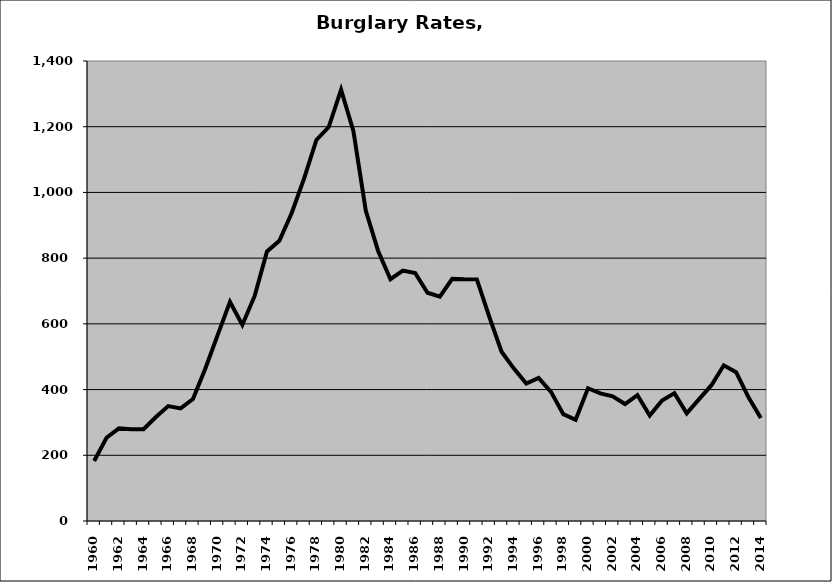
| Category | Burglary |
|---|---|
| 1960.0 | 182.561 |
| 1961.0 | 253.301 |
| 1962.0 | 281.804 |
| 1963.0 | 279.266 |
| 1964.0 | 279.358 |
| 1965.0 | 316.442 |
| 1966.0 | 349.78 |
| 1967.0 | 342.566 |
| 1968.0 | 371.083 |
| 1969.0 | 463.319 |
| 1970.0 | 565.556 |
| 1971.0 | 666.929 |
| 1972.0 | 596.628 |
| 1973.0 | 684.956 |
| 1974.0 | 820.421 |
| 1975.0 | 853.056 |
| 1976.0 | 937.47 |
| 1977.0 | 1041.696 |
| 1978.0 | 1159.701 |
| 1979.0 | 1198.985 |
| 1980.0 | 1312.895 |
| 1981.0 | 1186.096 |
| 1982.0 | 945.005 |
| 1983.0 | 821.898 |
| 1984.0 | 735.926 |
| 1985.0 | 762.325 |
| 1986.0 | 755.015 |
| 1987.0 | 694.797 |
| 1988.0 | 682.68 |
| 1989.0 | 736.856 |
| 1990.0 | 735.451 |
| 1991.0 | 735.385 |
| 1992.0 | 621.872 |
| 1993.0 | 515.111 |
| 1994.0 | 463.94 |
| 1995.0 | 418.641 |
| 1996.0 | 435.714 |
| 1997.0 | 393.18 |
| 1998.0 | 325.063 |
| 1999.0 | 307.876 |
| 2000.0 | 403.953 |
| 2001.0 | 388.213 |
| 2002.0 | 379.628 |
| 2003.0 | 356.094 |
| 2004.0 | 383.245 |
| 2005.0 | 320.779 |
| 2006.0 | 366.645 |
| 2007.0 | 389.185 |
| 2008.0 | 327.717 |
| 2009.0 | 371.062 |
| 2010.0 | 413.302 |
| 2011.0 | 473.817 |
| 2012.0 | 453.081 |
| 2013.0 | 376.451 |
| 2014.0 | 313.684 |